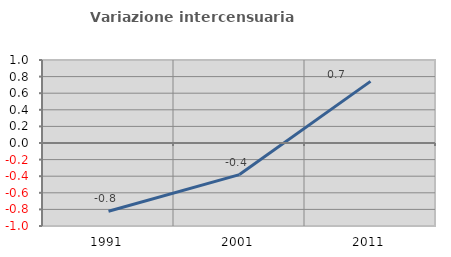
| Category | Variazione intercensuaria annua |
|---|---|
| 1991.0 | -0.822 |
| 2001.0 | -0.381 |
| 2011.0 | 0.742 |